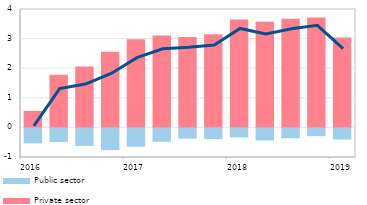
| Category | Private sector  | Public sector |
|---|---|---|
| 2016 | 0.559 | -0.507 |
| II | 1.776 | -0.463 |
| III | 2.053 | -0.589 |
| IV | 2.556 | -0.733 |
| 2017 | 2.977 | -0.621 |
| II | 3.109 | -0.452 |
| III | 3.055 | -0.347 |
| IV | 3.145 | -0.363 |
| 2018 | 3.649 | -0.305 |
| II | 3.567 | -0.411 |
| III | 3.668 | -0.334 |
| IV | 3.71 | -0.263 |
| 2019 | 3.039 | -0.375 |